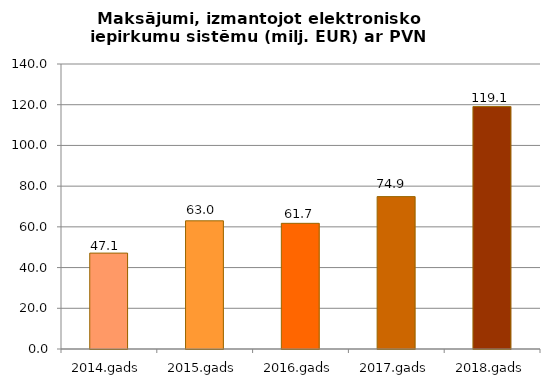
| Category | Maksājumi, izmantojot elektronisko iepirkumu sistēmu (milj. EUR) ar PVN |
|---|---|
| 2014.gads | 47.111 |
| 2015.gads | 62.966 |
| 2016.gads | 61.731 |
| 2017.gads | 74.856 |
| 2018.gads | 119.077 |